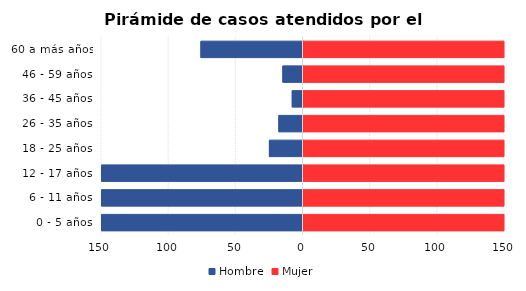
| Category | Hombre | Mujer |
|---|---|---|
| 0 - 5 años | -487 | 437 |
| 6 - 11 años | -560 | 855 |
| 12 - 17 años | -270 | 1182 |
| 18 - 25 años | -25 | 668 |
| 26 - 35 años | -18 | 755 |
| 36 - 45 años | -8 | 497 |
| 46 - 59 años | -15 | 280 |
| 60 a más años | -76 | 178 |